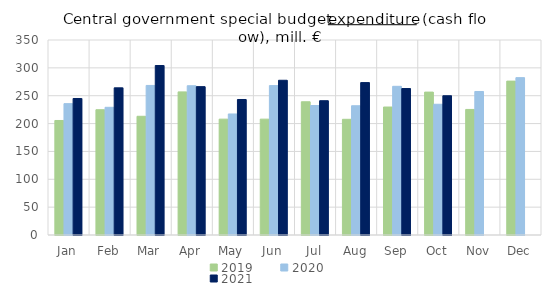
| Category | 2019 | 2020 | 2021 |
|---|---|---|---|
| Jan | 205518.755 | 235781.445 | 245021.603 |
| Feb | 224878.975 | 229202.237 | 264114.802 |
| Mar | 213066.431 | 268426.032 | 304192.595 |
| Apr | 256886.174 | 267906.805 | 266305.843 |
| May | 207946.975 | 217225.441 | 243231.118 |
| Jun | 207932.69 | 268178.04 | 277705.46 |
| Jul | 239136.34 | 232397.631 | 241038.074 |
| Aug | 207656.187 | 232000.053 | 273534.561 |
| Sep | 229689.005 | 266855.812 | 262890.697 |
| Oct | 256495.755 | 234655.305 | 249947.821 |
| Nov | 225363.041 | 257570.365 | 0 |
| Dec | 276195.004 | 282446.284 | 0 |